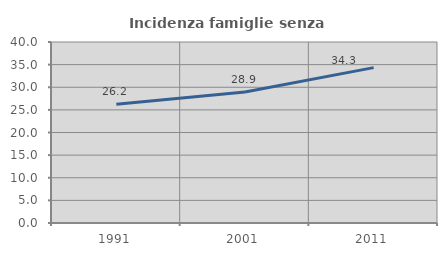
| Category | Incidenza famiglie senza nuclei |
|---|---|
| 1991.0 | 26.219 |
| 2001.0 | 28.945 |
| 2011.0 | 34.337 |